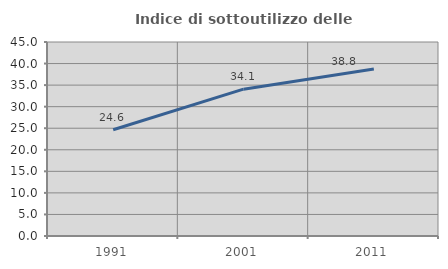
| Category | Indice di sottoutilizzo delle abitazioni  |
|---|---|
| 1991.0 | 24.648 |
| 2001.0 | 34.055 |
| 2011.0 | 38.752 |